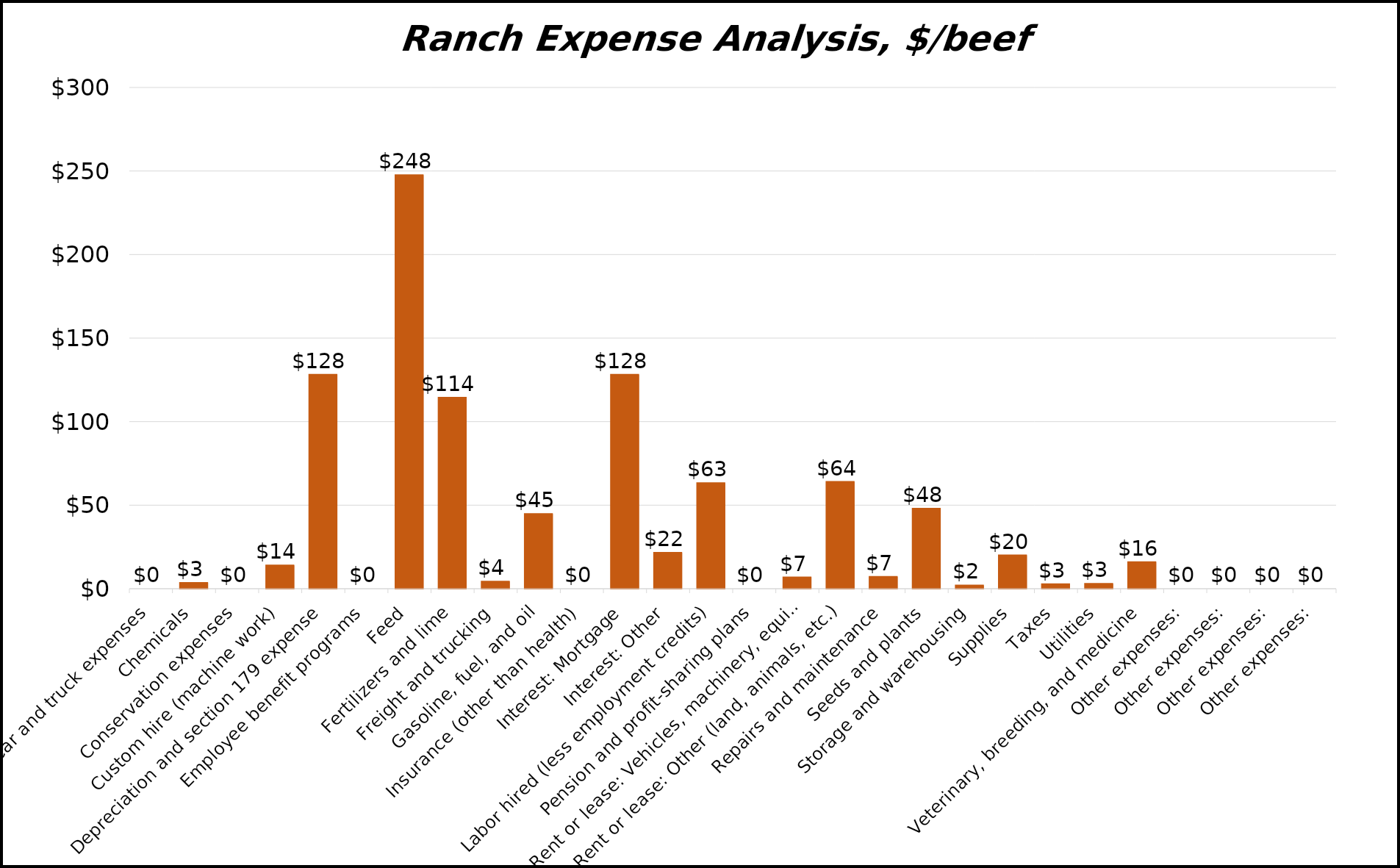
| Category | $/beef cow |
|---|---|
| Car and truck expenses | 0 |
| Chemicals | 3.48 |
| Conservation expenses | 0 |
| Custom hire (machine work) | 14 |
| Depreciation and section 179 expense | 128.16 |
| Employee benefit programs | 0 |
| Feed | 247.568 |
| Fertilizers and lime | 114.4 |
| Freight and trucking | 4.32 |
| Gasoline, fuel, and oil | 44.8 |
| Insurance (other than health) | 0 |
| Interest: Mortgage | 128.16 |
| Interest: Other | 21.56 |
| Labor hired (less employment credits) | 63.2 |
| Pension and profit-sharing plans | 0 |
| Rent or lease: Vehicles, machinery, equipment | 6.8 |
| Rent or lease: Other (land, animals, etc.) | 64 |
| Repairs and maintenance | 7.2 |
| Seeds and plants | 48 |
| Storage and warehousing | 2 |
| Supplies | 20 |
| Taxes | 2.8 |
| Utilities | 3 |
| Veterinary, breeding, and medicine | 16 |
| Other expenses: | 0 |
| Other expenses: | 0 |
| Other expenses: | 0 |
| Other expenses: | 0 |